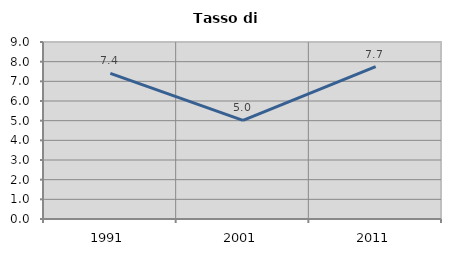
| Category | Tasso di disoccupazione   |
|---|---|
| 1991.0 | 7.401 |
| 2001.0 | 5.016 |
| 2011.0 | 7.746 |